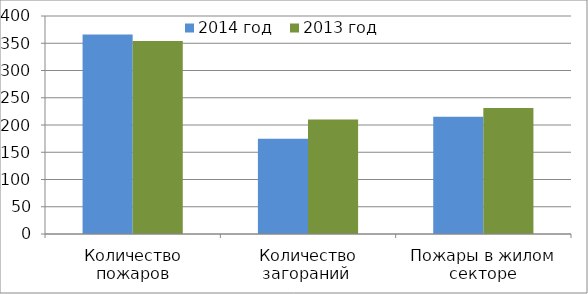
| Category | 2014 год | 2013 год |
|---|---|---|
| Количество пожаров | 366 | 354 |
| Количество загораний  | 175 | 210 |
| Пожары в жилом секторе | 215 | 231 |